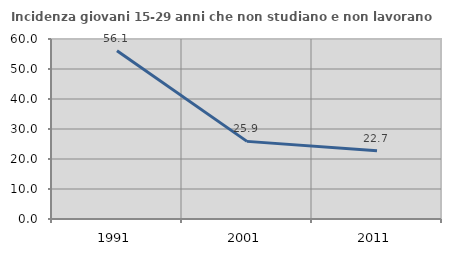
| Category | Incidenza giovani 15-29 anni che non studiano e non lavorano  |
|---|---|
| 1991.0 | 56.082 |
| 2001.0 | 25.876 |
| 2011.0 | 22.727 |